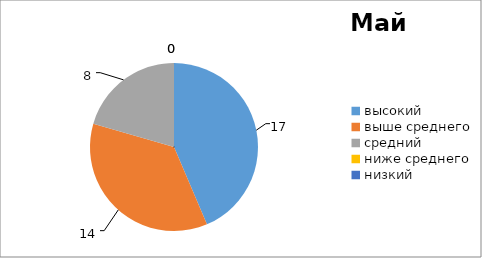
| Category | Series 2 | Series 1 | Series 0 |
|---|---|---|---|
| высокий  | 17 | 13 | 18 |
| выше среднего | 14 | 15 | 12 |
| средний | 8 | 11 | 8 |
| ниже среднего | 0 | 0 | 1 |
| низкий | 0 | 0 | 0 |